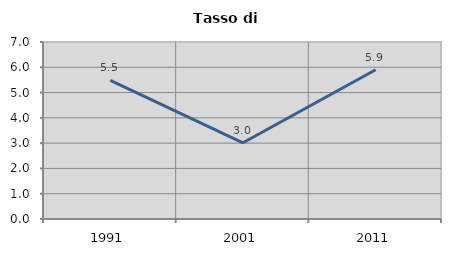
| Category | Tasso di disoccupazione   |
|---|---|
| 1991.0 | 5.486 |
| 2001.0 | 3.015 |
| 2011.0 | 5.902 |